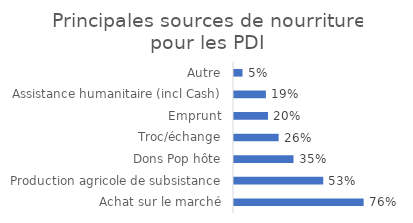
| Category | Fréquence |
|---|---|
| Achat sur le marché | 0.762 |
| Production agricole de subsistance | 0.525 |
| Dons Pop hôte | 0.35 |
| Troc/échange | 0.262 |
| Emprunt | 0.2 |
| Assistance humanitaire (incl Cash) | 0.188 |
| Autre | 0.05 |